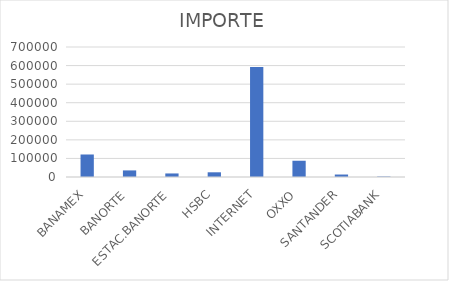
| Category | IMPORTE |
|---|---|
| BANAMEX | 121195.17 |
| BANORTE | 35493.7 |
| ESTAC.BANORTE | 19109.5 |
| HSBC | 25323.46 |
| INTERNET | 592370.28 |
| OXXO | 87514.85 |
| SANTANDER | 13323.54 |
| SCOTIABANK | 2555.1 |